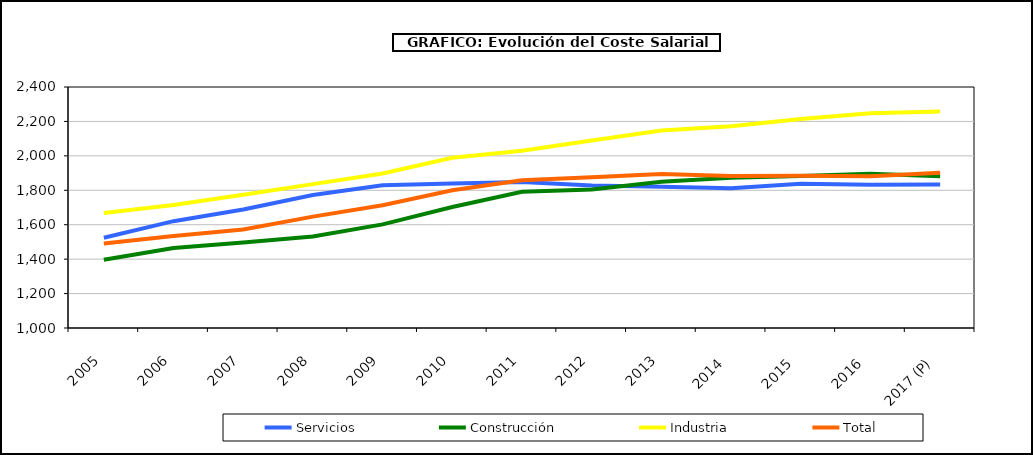
| Category | Servicios | Construcción | Industria | Total |
|---|---|---|---|---|
|  2005 | 1524.1 |  |  |  |
|  2006 | 1620.663 |  |  |  |
|  2007 | 1688.575 |  |  |  |
|  2008 | 1772.287 |  |  |  |
|  2009 | 1829.705 |  |  |  |
|  2010 | 1838.733 |  |  |  |
|  2011 | 1848.135 |  |  |  |
|  2012 | 1827.48 |  |  |  |
|  2013 | 1820.003 |  |  |  |
|  2014  | 1811.798 |  |  |  |
|  2015  | 1837.24 |  |  |  |
|  2016  | 1832.053 |  |  |  |
|  2017 (P)  | 1834.253 |  |  |  |